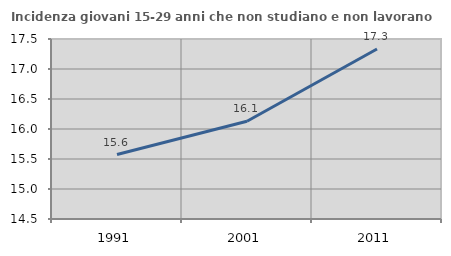
| Category | Incidenza giovani 15-29 anni che non studiano e non lavorano  |
|---|---|
| 1991.0 | 15.574 |
| 2001.0 | 16.129 |
| 2011.0 | 17.333 |